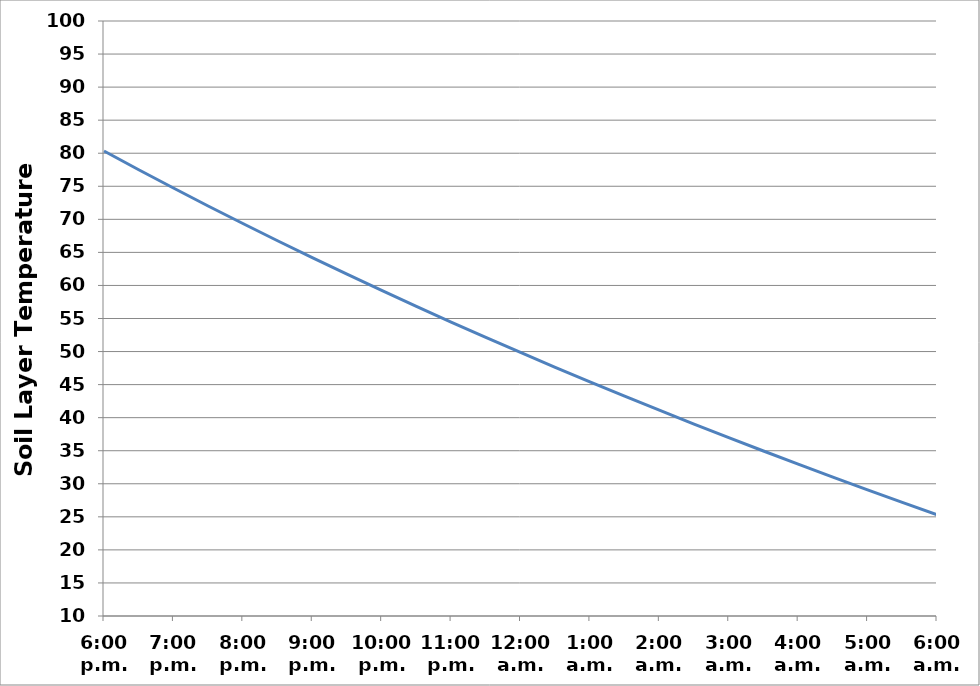
| Category | Series 0 |
|---|---|
| 6:00 p.m. | 80.33 |
| 6:30 p.m. | 77.503 |
| 7:00 p.m. | 74.734 |
| 7:30 p.m. | 72.022 |
| 8:00 p.m. | 69.365 |
| 8:30 p.m. | 66.761 |
| 9:00 p.m. | 64.207 |
| 9:30 p.m. | 61.702 |
| 10:00 p.m. | 59.246 |
| 10:30 p.m. | 56.835 |
| 11:00 p.m. | 54.468 |
| 11:30 p.m. | 52.145 |
| 12:00 a.m. | 49.863 |
| 12:30 a.m. | 47.622 |
| 1:00 a.m. | 45.42 |
| 1:30 a.m. | 43.256 |
| 2:00 a.m. | 41.129 |
| 2:30 a.m. | 39.037 |
| 3:00 a.m. | 36.981 |
| 3:30 a.m. | 34.958 |
| 4:00 a.m. | 32.967 |
| 4:30 a.m. | 31.009 |
| 5:00 a.m. | 29.082 |
| 5:30 a.m. | 27.184 |
| 6:00 a.m. | 25.316 |